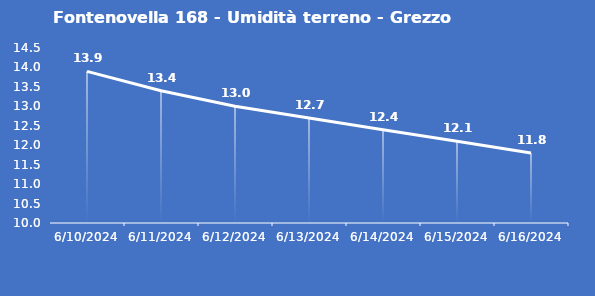
| Category | Fontenovella 168 - Umidità terreno - Grezzo (%VWC) |
|---|---|
| 6/10/24 | 13.9 |
| 6/11/24 | 13.4 |
| 6/12/24 | 13 |
| 6/13/24 | 12.7 |
| 6/14/24 | 12.4 |
| 6/15/24 | 12.1 |
| 6/16/24 | 11.8 |